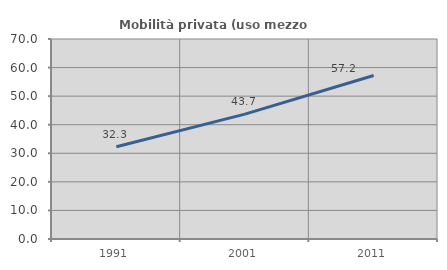
| Category | Mobilità privata (uso mezzo privato) |
|---|---|
| 1991.0 | 32.302 |
| 2001.0 | 43.699 |
| 2011.0 | 57.236 |